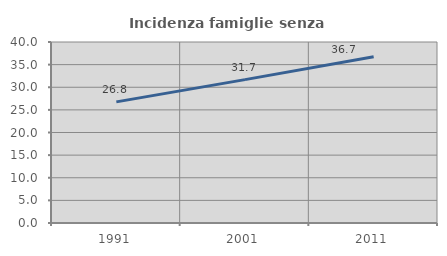
| Category | Incidenza famiglie senza nuclei |
|---|---|
| 1991.0 | 26.763 |
| 2001.0 | 31.683 |
| 2011.0 | 36.742 |